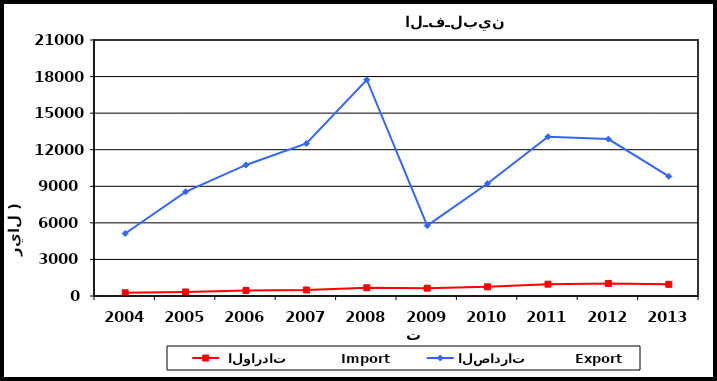
| Category |  الواردات           Import | الصادرات          Export |
|---|---|---|
| 2004.0 | 263 | 5130 |
| 2005.0 | 331 | 8544 |
| 2006.0 | 447 | 10751 |
| 2007.0 | 493 | 12510 |
| 2008.0 | 676 | 17742 |
| 2009.0 | 640 | 5773 |
| 2010.0 | 750 | 9226 |
| 2011.0 | 972 | 13064 |
| 2012.0 | 1030 | 12870 |
| 2013.0 | 958 | 9818 |